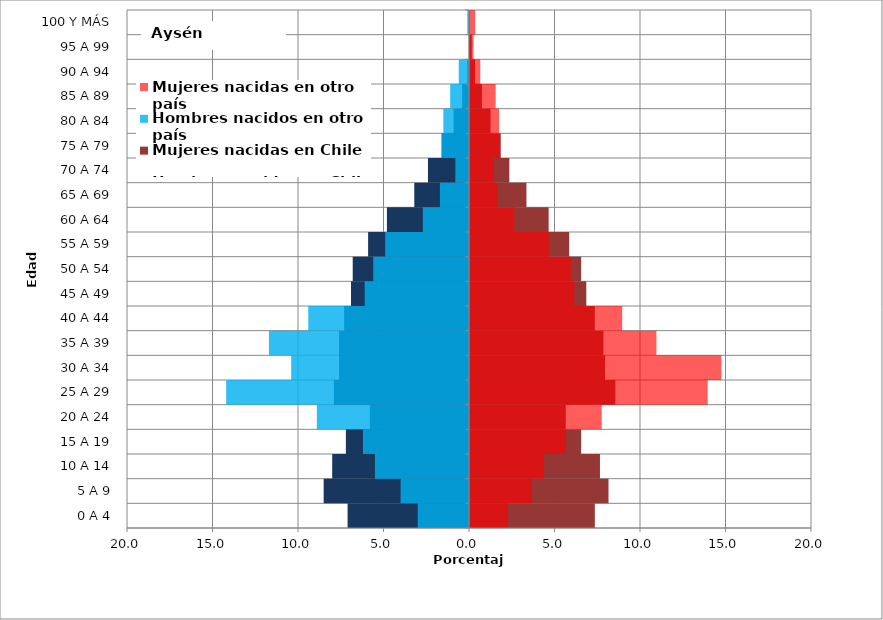
| Category | Hombres nacidos en Chile | Mujeres nacidas en Chile | Hombres nacidos en otro país | Mujeres nacidas en otro país |
|---|---|---|---|---|
| 0 A 4 | -7.1 | 7.3 | -3 | 2.2 |
| 5 A 9 | -8.5 | 8.1 | -4 | 3.6 |
| 10 A 14 | -8 | 7.6 | -5.5 | 4.3 |
| 15 A 19 | -7.2 | 6.5 | -6.2 | 5.6 |
| 20 A 24 | -5.8 | 5.6 | -8.9 | 7.7 |
| 25 A 29 | -7.9 | 8.5 | -14.2 | 13.9 |
| 30 A 34 | -7.6 | 7.9 | -10.4 | 14.7 |
| 35 A 39 | -7.6 | 7.8 | -11.7 | 10.9 |
| 40 A 44 | -7.3 | 7.3 | -9.4 | 8.9 |
| 45 A 49 | -6.9 | 6.8 | -6.1 | 6.1 |
| 50 A 54 | -6.8 | 6.5 | -5.6 | 5.9 |
| 55 A 59 | -5.9 | 5.8 | -4.9 | 4.6 |
| 60 A 64 | -4.8 | 4.6 | -2.7 | 2.6 |
| 65 A 69 | -3.2 | 3.3 | -1.7 | 1.6 |
| 70 A 74 | -2.4 | 2.3 | -0.8 | 1.4 |
| 75 A 79 | -1.6 | 1.8 | -1.6 | 1.7 |
| 80 A 84 | -0.9 | 1.2 | -1.5 | 1.7 |
| 85 A 89 | -0.4 | 0.7 | -1.1 | 1.5 |
| 90 A 94 | -0.1 | 0.3 | -0.6 | 0.6 |
| 95 A 99 | 0 | 0.1 | 0 | 0.2 |
| 100 Y MÁS | 0 | 0 | -0.1 | 0.3 |